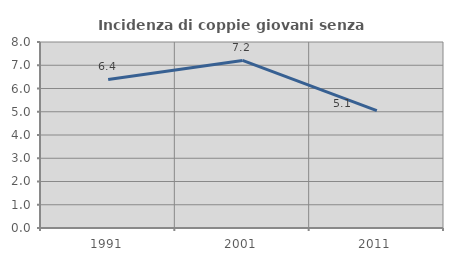
| Category | Incidenza di coppie giovani senza figli |
|---|---|
| 1991.0 | 6.389 |
| 2001.0 | 7.207 |
| 2011.0 | 5.051 |